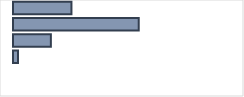
| Category | Series 0 |
|---|---|
| 0 | 25.749 |
| 1 | 55.386 |
| 2 | 16.683 |
| 3 | 2.182 |
| 4 | 0 |